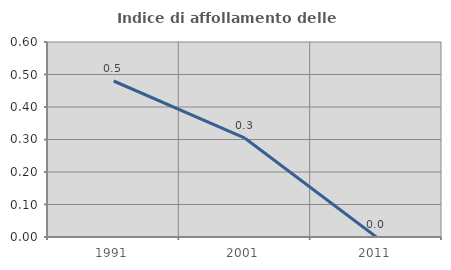
| Category | Indice di affollamento delle abitazioni  |
|---|---|
| 1991.0 | 0.48 |
| 2001.0 | 0.304 |
| 2011.0 | 0 |